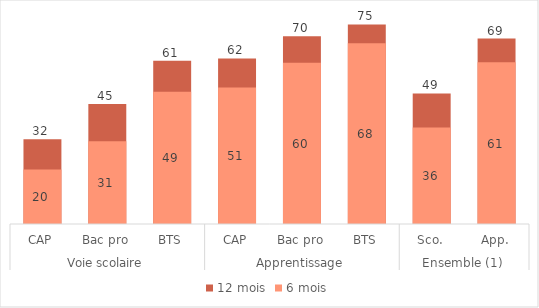
| Category | 12 mois | 6 mois |
|---|---|---|
| 0 | 31.7 | 20.4 |
| 1 | 44.9 | 30.9 |
| 2 | 61 | 49.4 |
| 3 | 61.9 | 51 |
| 4 | 70.2 | 60.3 |
| 5 | 74.6 | 67.6 |
| 6 | 48.8 | 36.1 |
| 7 | 69.3 | 60.5 |